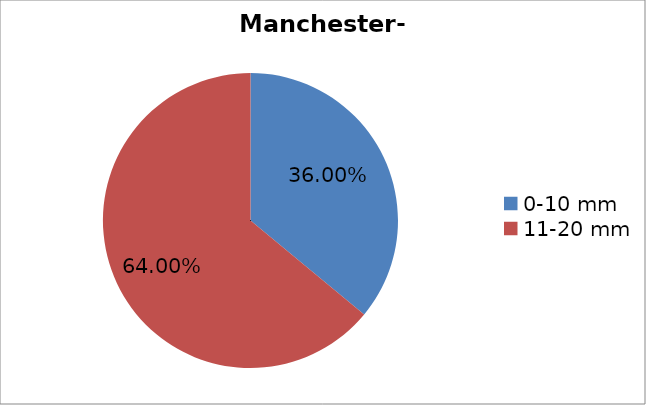
| Category | Series 0 |
|---|---|
| 0-10 mm | 0.36 |
| 11-20 mm | 0.64 |